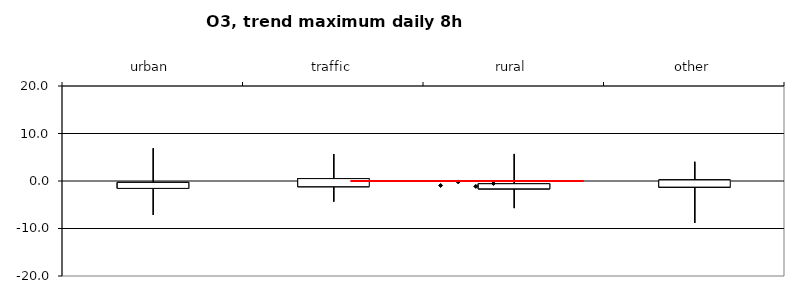
| Category | Series 0 | Series 1 | Series 2 | Series 3 |
|---|---|---|---|---|
| urban | -1.558 | -7.152 | 6.897 | -0.292 |
| traffic | -1.197 | -4.344 | 5.683 | 0.508 |
| rural | -1.649 | -5.708 | 5.699 | -0.573 |
| other | -1.287 | -8.834 | 4.042 | 0.214 |